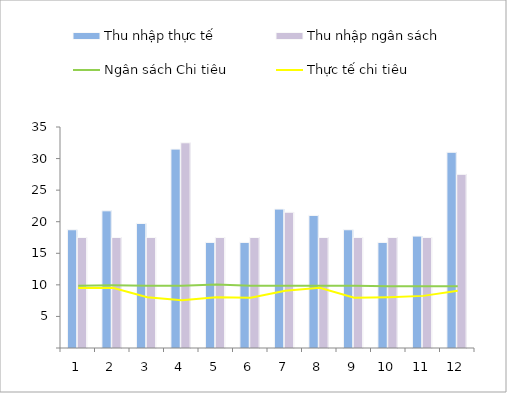
| Category | Thu nhập thực tế | Thu nhập ngân sách |
|---|---|---|
| 0 | 18725 | 17500 |
| 1 | 21725 | 17500 |
| 2 | 19725 | 17500 |
| 3 | 31500 | 32500 |
| 4 | 16725 | 17500 |
| 5 | 16725 | 17500 |
| 6 | 22000 | 21500 |
| 7 | 21000 | 17500 |
| 8 | 18725 | 17500 |
| 9 | 16725 | 17500 |
| 10 | 17725 | 17500 |
| 11 | 31000 | 27500 |